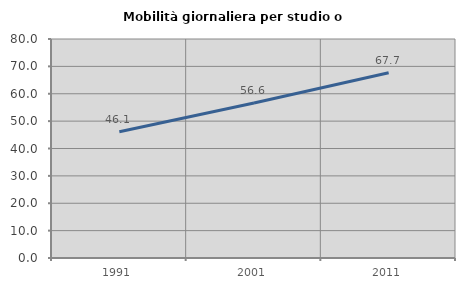
| Category | Mobilità giornaliera per studio o lavoro |
|---|---|
| 1991.0 | 46.115 |
| 2001.0 | 56.612 |
| 2011.0 | 67.69 |